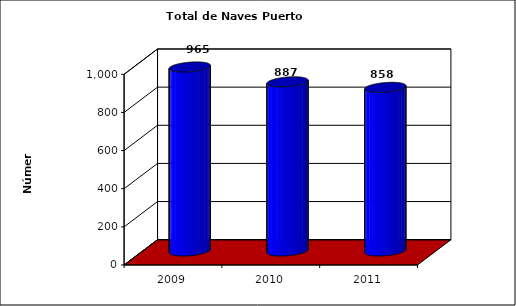
| Category | Series 0 |
|---|---|
| 2009.0 | 965 |
| 2010.0 | 887 |
| 2011.0 | 858 |